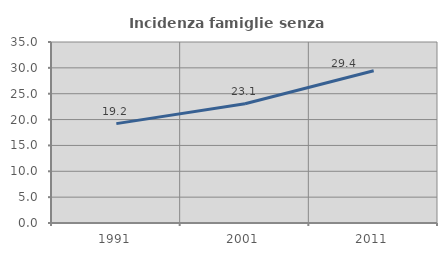
| Category | Incidenza famiglie senza nuclei |
|---|---|
| 1991.0 | 19.217 |
| 2001.0 | 23.072 |
| 2011.0 | 29.433 |